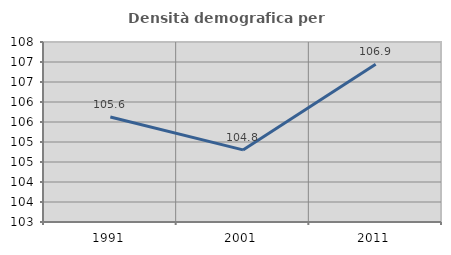
| Category | Densità demografica |
|---|---|
| 1991.0 | 105.623 |
| 2001.0 | 104.802 |
| 2011.0 | 106.944 |